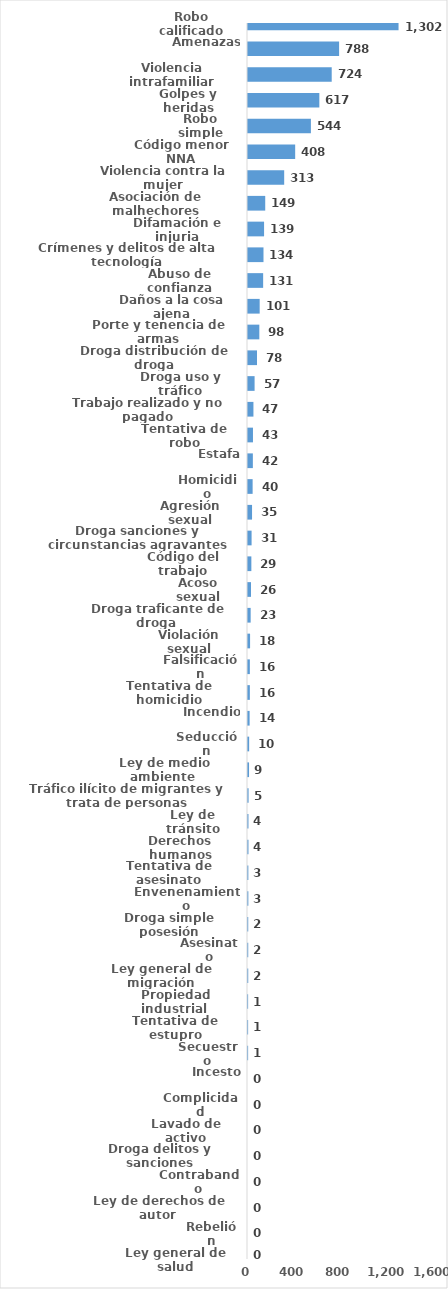
| Category | Series 0 |
|---|---|
| Robo calificado | 1302 |
| Amenazas | 788 |
| Violencia intrafamiliar | 724 |
| Golpes y heridas | 617 |
| Robo simple | 544 |
| Código menor NNA | 408 |
| Violencia contra la mujer | 313 |
| Asociación de malhechores | 149 |
| Difamación e injuria | 139 |
| Crímenes y delitos de alta tecnología | 134 |
| Abuso de confianza | 131 |
| Daños a la cosa ajena | 101 |
| Porte y tenencia de armas | 98 |
| Droga distribución de droga | 78 |
| Droga uso y tráfico | 57 |
| Trabajo realizado y no pagado | 47 |
| Tentativa de robo | 43 |
| Estafa | 42 |
| Homicidio | 40 |
| Agresión sexual | 35 |
| Droga sanciones y circunstancias agravantes | 31 |
| Código del trabajo | 29 |
| Acoso sexual | 26 |
| Droga traficante de droga  | 23 |
| Violación sexual | 18 |
| Falsificación | 16 |
| Tentativa de homicidio | 16 |
| Incendio | 14 |
| Seducción | 10 |
| Ley de medio ambiente  | 9 |
| Tráfico ilícito de migrantes y trata de personas | 5 |
| Ley de tránsito | 4 |
| Derechos humanos | 4 |
| Tentativa de asesinato | 3 |
| Envenenamiento | 3 |
| Droga simple posesión | 2 |
| Asesinato | 2 |
| Ley general de migración | 2 |
| Propiedad industrial  | 1 |
| Tentativa de estupro | 1 |
| Secuestro | 1 |
| Incesto | 0 |
| Complicidad | 0 |
| Lavado de activo | 0 |
| Droga delitos y sanciones | 0 |
| Contrabando | 0 |
| Ley de derechos de autor  | 0 |
| Rebelión | 0 |
| Ley general de salud | 0 |